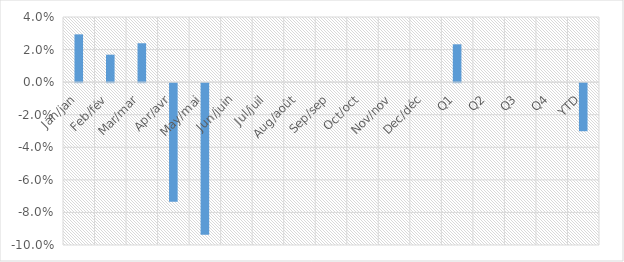
| Category | Total YoY % Change |
|---|---|
| Jan/jan | 0.029 |
| Feb/fév | 0.017 |
| Mar/mar | 0.024 |
| Apr/avr | -0.073 |
| May/mai | -0.093 |
| Jun/juin | 0 |
| Jul/juil | 0 |
| Aug/août | 0 |
| Sep/sep | 0 |
| Oct/oct | 0 |
| Nov/nov | 0 |
| Dec/déc | 0 |
| Q1 | 0.023 |
| Q2 | 0 |
| Q3 | 0 |
| Q4 | 0 |
| YTD | -0.03 |